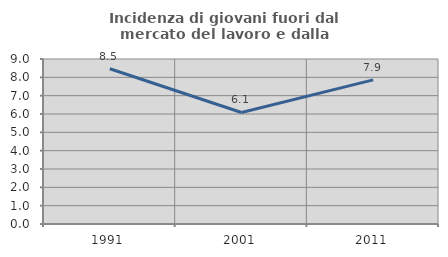
| Category | Incidenza di giovani fuori dal mercato del lavoro e dalla formazione  |
|---|---|
| 1991.0 | 8.469 |
| 2001.0 | 6.084 |
| 2011.0 | 7.86 |